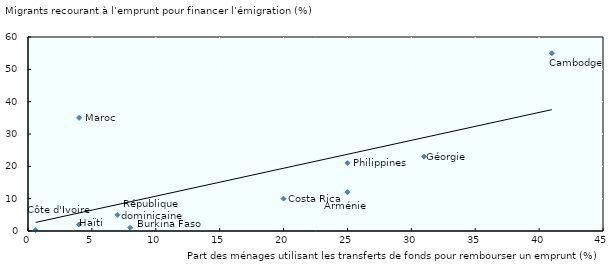
| Category | Series 0 |
|---|---|
| 25.0 | 12 |
| 8.0 | 1 |
| 41.0 | 55 |
| 20.0 | 10 |
| 7.0 | 5 |
| 31.0 | 23 |
| 4.0 | 2 |
| 25.0 | 21 |
| 0.6 | 0.3 |
| 4.0 | 35 |